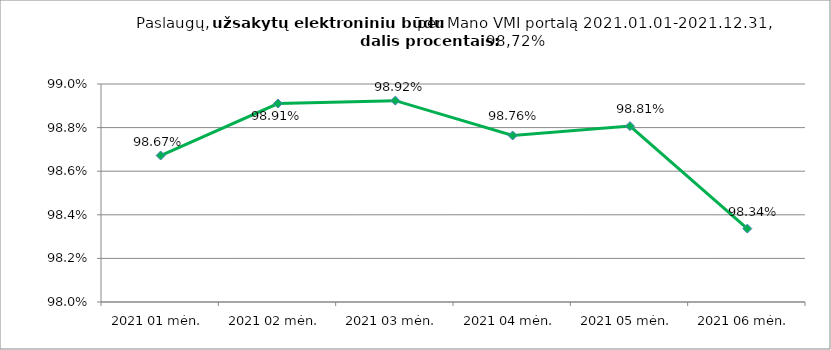
| Category | Elektroniniu būdu užsakytų paslaugų dalis procentais (lyginant su visomis Mano VMI portale užsakytomis paslaugomis) |
|---|---|
| 2021 01 mėn. | 0.987 |
| 2021 02 mėn. | 0.989 |
| 2021 03 mėn. | 0.989 |
| 2021 04 mėn. | 0.988 |
| 2021 05 mėn. | 0.988 |
| 2021 06 mėn. | 0.983 |